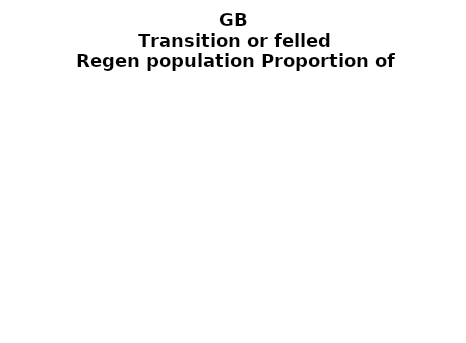
| Category | Transition or felled |
|---|---|
| None | 0.119 |
| Seedlings only | 0 |
| Seedlings, saplings only | 0.126 |
| Seedlings, saplings, <7 cm trees | 0.106 |
| Saplings only | 0.364 |
| <7 cm trees, seedlings only | 0 |
| <7 cm trees, saplings only | 0.247 |
| <7 cm Trees only | 0.037 |